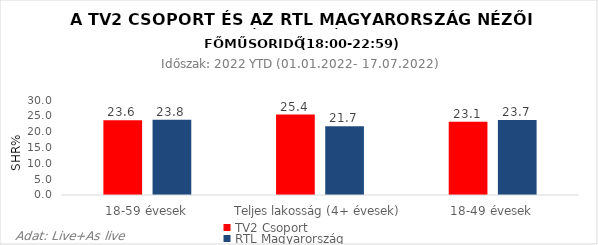
| Category | TV2 Csoport | RTL Magyarország |
|---|---|---|
| 18-59 évesek | 23.6 | 23.8 |
| Teljes lakosság (4+ évesek) | 25.4 | 21.7 |
| 18-49 évesek | 23.1 | 23.7 |